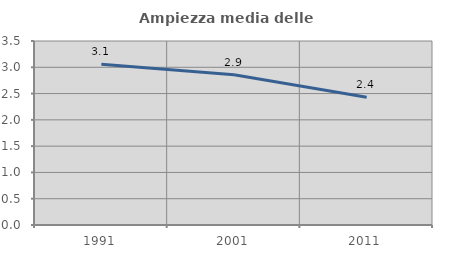
| Category | Ampiezza media delle famiglie |
|---|---|
| 1991.0 | 3.06 |
| 2001.0 | 2.858 |
| 2011.0 | 2.43 |